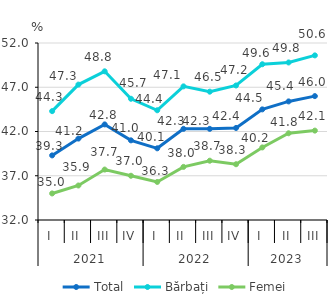
| Category | Total | Bărbați | Femei |
|---|---|---|---|
| 0 | 39.3 | 44.3 | 35 |
| 1 | 41.2 | 47.3 | 35.9 |
| 2 | 42.8 | 48.8 | 37.7 |
| 3 | 41 | 45.7 | 37 |
| 4 | 40.1 | 44.4 | 36.3 |
| 5 | 42.3 | 47.1 | 38 |
| 6 | 42.3 | 46.5 | 38.7 |
| 7 | 42.4 | 47.2 | 38.3 |
| 8 | 44.5 | 49.6 | 40.2 |
| 9 | 45.4 | 49.8 | 41.8 |
| 10 | 46 | 50.6 | 42.1 |